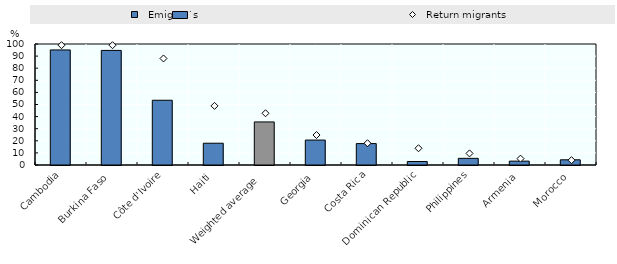
| Category |   Emigrants  |
|---|---|
| Cambodia | 95.1 |
| Burkina Faso | 94.7 |
| Côte d'Ivoire | 53.5 |
| Haiti | 18 |
| Weighted average  | 35.6 |
| Georgia | 20.6 |
| Costa Rica | 17.7 |
| Dominican Republic | 2.9 |
| Philippines | 5.5 |
| Armenia | 3.2 |
| Morocco | 4.3 |